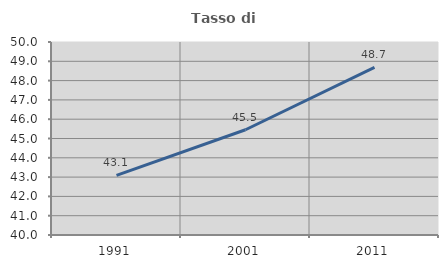
| Category | Tasso di occupazione   |
|---|---|
| 1991.0 | 43.089 |
| 2001.0 | 45.455 |
| 2011.0 | 48.681 |